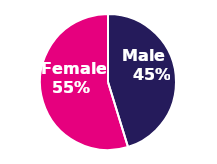
| Category | Series 0 |
|---|---|
| 0 | 127487 |
| 1 | 154304 |